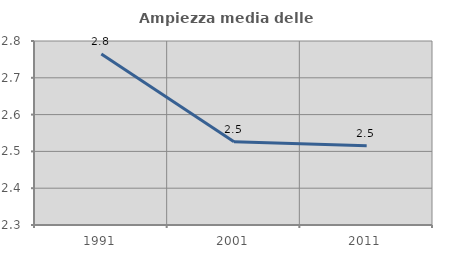
| Category | Ampiezza media delle famiglie |
|---|---|
| 1991.0 | 2.764 |
| 2001.0 | 2.526 |
| 2011.0 | 2.515 |